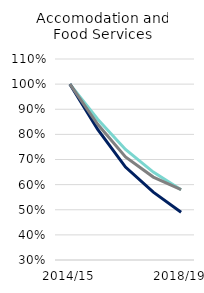
| Category | UK and RoI | EEA | Non-EEA |
|---|---|---|---|
| 2014/15 | 1 | 1 | 1 |
| 2015/16 | 0.86 | 0.82 | 0.84 |
| 2016/16 | 0.74 | 0.67 | 0.71 |
| 2017/18 | 0.65 | 0.57 | 0.63 |
| 2018/19 | 0.58 | 0.49 | 0.58 |